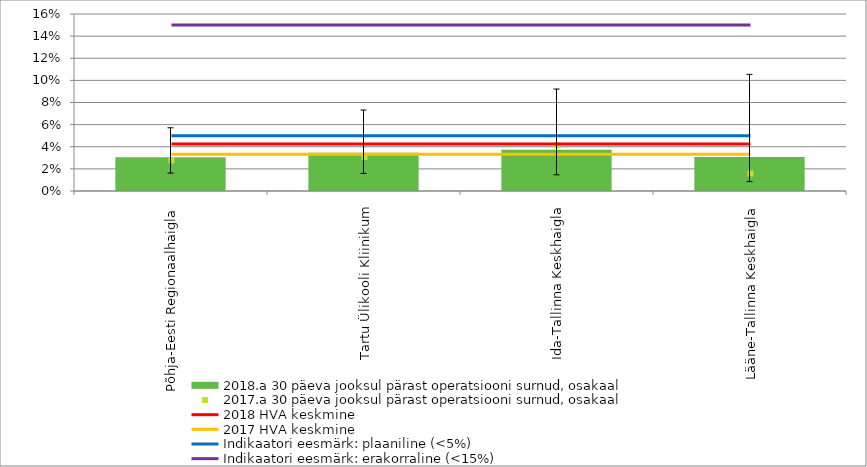
| Category | 2018.a 30 päeva jooksul pärast operatsiooni surnud, osakaal |
|---|---|
| Põhja-Eesti Regionaalhaigla | 0.031 |
| Tartu Ülikooli Kliinikum | 0.034 |
| Ida-Tallinna Keskhaigla | 0.037 |
| Lääne-Tallinna Keskhaigla | 0.031 |